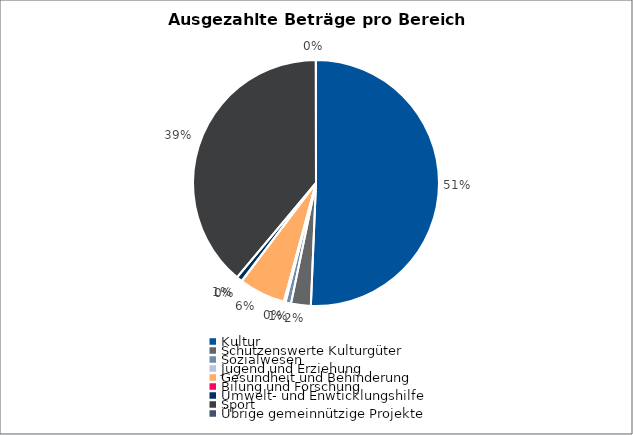
| Category | Series 0 |
|---|---|
| Kultur | 557640.5 |
| Schützenswerte Kulturgüter | 28500 |
| Sozialwesen | 8000 |
| Jugend und Erziehung | 2500 |
| Gesundheit und Behinderung | 67257.35 |
| Bilung und Forschung | 0 |
| Umwelt- und Enwticklungshilfe | 8500 |
| Sport | 427940.25 |
| Übrige gemeinnützige Projekte | 265 |